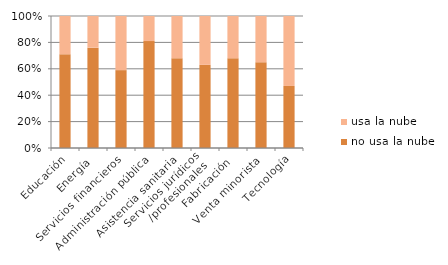
| Category | no usa la nube | usa la nube |
|---|---|---|
| Educación | 0.71 | 0.29 |
| Energía | 0.76 | 0.24 |
| Servicios financieros | 0.59 | 0.41 |
| Administración pública | 0.81 | 0.19 |
| Asistencia sanitaria | 0.68 | 0.32 |
| Servicios jurídicos
/profesionales | 0.63 | 0.37 |
| Fabricación | 0.68 | 0.32 |
| Venta minorista | 0.65 | 0.35 |
| Tecnología | 0.47 | 0.53 |